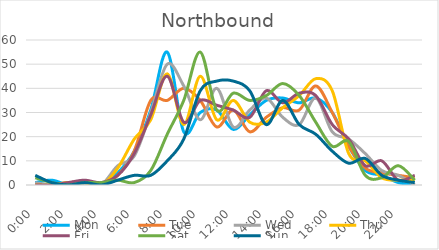
| Category | Mon | Tue | Wed | Thu | Fri | Sat | Sun |
|---|---|---|---|---|---|---|---|
| 0.0 | 1 | 0 | 1 | 0 | 0 | 3 | 4 |
| 0.041667 | 2 | 0 | 0 | 0 | 0 | 1 | 1 |
| 0.083333 | 0 | 1 | 1 | 1 | 1 | 0 | 0 |
| 0.125 | 0 | 0 | 0 | 1 | 2 | 1 | 1 |
| 0.166667 | 0 | 0 | 0 | 0 | 1 | 1 | 0 |
| 0.208333 | 5 | 4 | 8 | 7 | 4 | 2 | 2 |
| 0.25 | 14 | 14 | 12 | 19 | 13 | 1 | 4 |
| 0.291667 | 31 | 35 | 30 | 27 | 29 | 6 | 4 |
| 0.333333 | 55 | 35 | 50 | 46 | 45 | 21 | 10 |
| 0.375 | 22 | 40 | 41 | 25 | 26 | 35 | 19 |
| 0.416667 | 30 | 35 | 27 | 45 | 35 | 55 | 39 |
| 0.458333 | 31 | 24 | 40 | 27 | 33 | 31 | 43 |
| 0.5 | 23 | 31 | 24 | 35 | 31 | 38 | 43 |
| 0.541667 | 29 | 22 | 31 | 26 | 28 | 35 | 39 |
| 0.5833333333333334 | 35 | 28 | 36 | 26 | 39 | 37 | 25 |
| 0.625 | 36 | 32 | 28 | 32 | 34 | 42 | 35 |
| 0.666667 | 34 | 31 | 25 | 37 | 38 | 37 | 25 |
| 0.708333 | 36 | 41 | 36 | 44 | 37 | 26 | 21 |
| 0.75 | 30 | 30 | 22 | 39 | 25 | 16 | 14 |
| 0.791667 | 16 | 16 | 19 | 13 | 19 | 18 | 9 |
| 0.833333 | 6 | 7 | 13 | 10 | 8 | 4 | 11 |
| 0.875 | 4 | 5 | 6 | 3 | 10 | 3 | 4 |
| 0.916667 | 1 | 4 | 4 | 2 | 2 | 8 | 2 |
| 0.958333 | 0 | 3 | 0 | 2 | 4 | 2 | 1 |